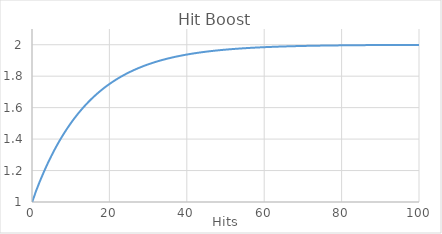
| Category | Hit Boost |
|---|---|
| -2.0 | 1 |
| -1.0 | 1 |
| 0.0 | 1 |
| 1.0 | 1.067 |
| 2.0 | 1.129 |
| 3.0 | 1.188 |
| 4.0 | 1.242 |
| 5.0 | 1.293 |
| 6.0 | 1.34 |
| 7.0 | 1.384 |
| 8.0 | 1.426 |
| 9.0 | 1.464 |
| 10.0 | 1.5 |
| 11.0 | 1.533 |
| 12.0 | 1.565 |
| 13.0 | 1.594 |
| 14.0 | 1.621 |
| 15.0 | 1.646 |
| 16.0 | 1.67 |
| 17.0 | 1.692 |
| 18.0 | 1.713 |
| 19.0 | 1.732 |
| 20.0 | 1.75 |
| 21.0 | 1.767 |
| 22.0 | 1.782 |
| 23.0 | 1.797 |
| 24.0 | 1.811 |
| 25.0 | 1.823 |
| 26.0 | 1.835 |
| 27.0 | 1.846 |
| 28.0 | 1.856 |
| 29.0 | 1.866 |
| 30.0 | 1.875 |
| 31.0 | 1.883 |
| 32.0 | 1.891 |
| 33.0 | 1.898 |
| 34.0 | 1.905 |
| 35.0 | 1.912 |
| 36.0 | 1.918 |
| 37.0 | 1.923 |
| 38.0 | 1.928 |
| 39.0 | 1.933 |
| 40.0 | 1.938 |
| 41.0 | 1.942 |
| 42.0 | 1.946 |
| 43.0 | 1.949 |
| 44.0 | 1.953 |
| 45.0 | 1.956 |
| 46.0 | 1.959 |
| 47.0 | 1.962 |
| 48.0 | 1.964 |
| 49.0 | 1.967 |
| 50.0 | 1.969 |
| 51.0 | 1.971 |
| 52.0 | 1.973 |
| 53.0 | 1.975 |
| 54.0 | 1.976 |
| 55.0 | 1.978 |
| 56.0 | 1.979 |
| 57.0 | 1.981 |
| 58.0 | 1.982 |
| 59.0 | 1.983 |
| 60.0 | 1.984 |
| 61.0 | 1.985 |
| 62.0 | 1.986 |
| 63.0 | 1.987 |
| 64.0 | 1.988 |
| 65.0 | 1.989 |
| 66.0 | 1.99 |
| 67.0 | 1.99 |
| 68.0 | 1.991 |
| 69.0 | 1.992 |
| 70.0 | 1.992 |
| 71.0 | 1.993 |
| 72.0 | 1.993 |
| 73.0 | 1.994 |
| 74.0 | 1.994 |
| 75.0 | 1.994 |
| 76.0 | 1.995 |
| 77.0 | 1.995 |
| 78.0 | 1.996 |
| 79.0 | 1.996 |
| 80.0 | 1.996 |
| 81.0 | 1.996 |
| 82.0 | 1.997 |
| 83.0 | 1.997 |
| 84.0 | 1.997 |
| 85.0 | 1.997 |
| 86.0 | 1.997 |
| 87.0 | 1.998 |
| 88.0 | 1.998 |
| 89.0 | 1.998 |
| 90.0 | 1.998 |
| 91.0 | 1.998 |
| 92.0 | 1.998 |
| 93.0 | 1.998 |
| 94.0 | 1.999 |
| 95.0 | 1.999 |
| 96.0 | 1.999 |
| 97.0 | 1.999 |
| 98.0 | 1.999 |
| 99.0 | 1.999 |
| 100.0 | 1.999 |